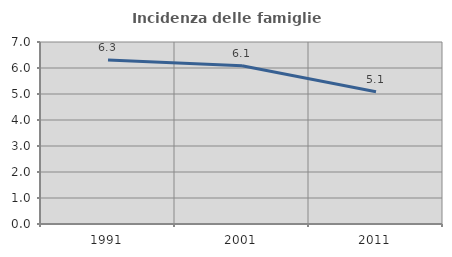
| Category | Incidenza delle famiglie numerose |
|---|---|
| 1991.0 | 6.306 |
| 2001.0 | 6.084 |
| 2011.0 | 5.085 |